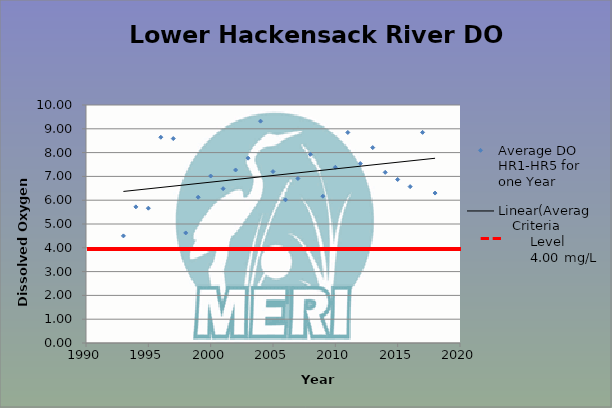
| Category | Average DO HR1-HR5 for one Year |
|---|---|
| 1993.0 | 4.5 |
| 1994.0 | 5.72 |
| 1995.0 | 5.665 |
| 1996.0 | 8.645 |
| 1997.0 | 8.59 |
| 1998.0 | 4.625 |
| 1999.0 | 6.125 |
| 2000.0 | 7.016 |
| 2001.0 | 6.484 |
| 2002.0 | 7.27 |
| 2003.0 | 7.766 |
| 2004.0 | 9.321 |
| 2005.0 | 7.203 |
| 2006.0 | 6.016 |
| 2007.0 | 6.912 |
| 2008.0 | 7.927 |
| 2009.0 | 6.167 |
| 2010.0 | 7.384 |
| 2011.0 | 8.846 |
| 2012.0 | 7.54 |
| 2013.0 | 8.21 |
| 2014.0 | 7.17 |
| 2015.0 | 6.87 |
| 2016.0 | 6.57 |
| 2017.0 | 8.85 |
| 2018.0 | 6.3 |